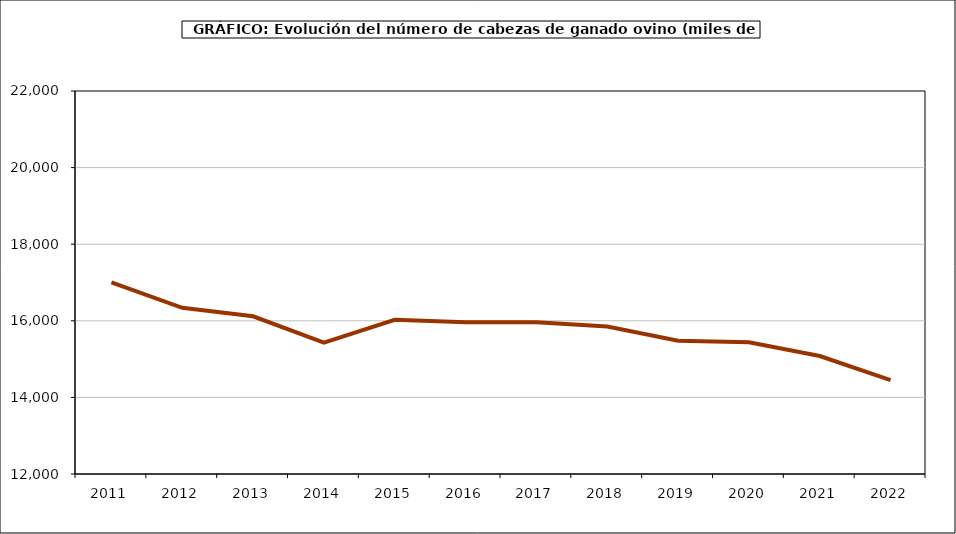
| Category | Series 0 |
|---|---|
| 2011.0 | 17003 |
| 2012.0 | 16339.373 |
| 2013.0 | 16118.586 |
| 2014.0 | 15431.804 |
| 2015.0 | 16026.374 |
| 2016.0 | 15962.892 |
| 2017.0 | 15963.106 |
| 2018.0 | 15852.525 |
| 2019.0 | 15478 |
| 2020.0 | 15440 |
| 2021.0 | 15081 |
| 2022.0 | 14453 |